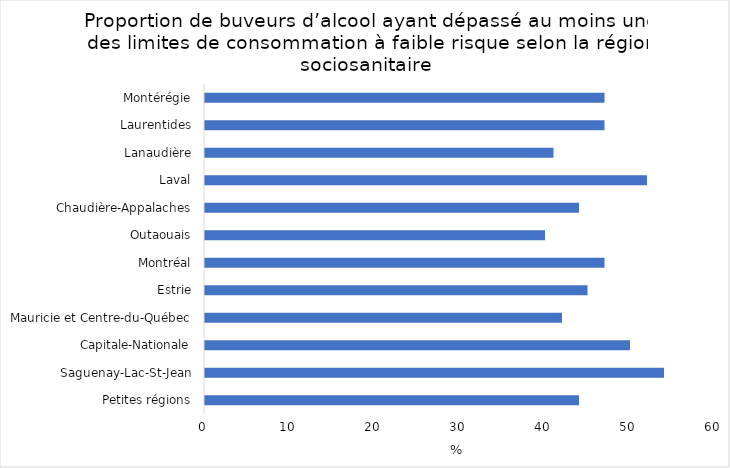
| Category | Series 0 |
|---|---|
| Petites régions | 44 |
| Saguenay-Lac-St-Jean | 54 |
| Capitale-Nationale | 50 |
| Mauricie et Centre-du-Québec | 42 |
| Estrie | 45 |
| Montréal | 47 |
| Outaouais | 40 |
| Chaudière-Appalaches | 44 |
| Laval | 52 |
| Lanaudière | 41 |
| Laurentides | 47 |
| Montérégie | 47 |